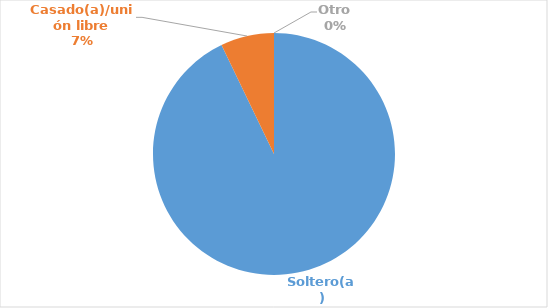
| Category | Series 0 |
|---|---|
| Soltero(a) | 0.929 |
| Casado(a)/unión libre | 0.071 |
| Otro | 0 |